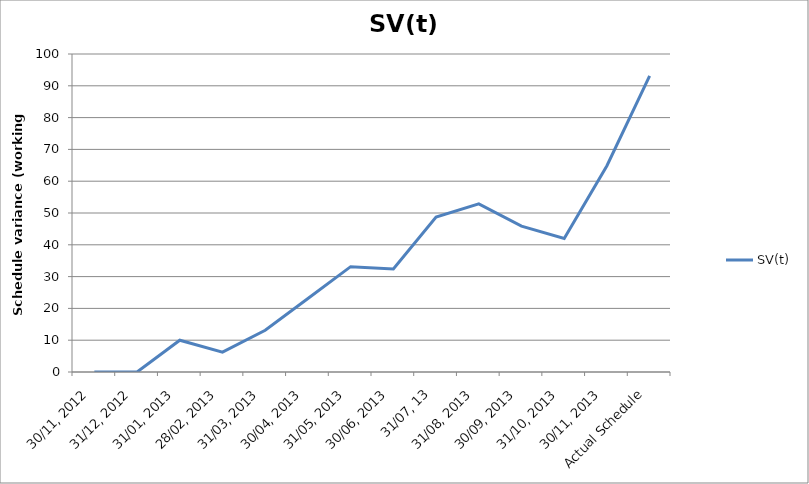
| Category | SV(t) |
|---|---|
| 30/11, 2012 | 0 |
| 31/12, 2012 | 0 |
| 31/01, 2013 | 10 |
| 28/02, 2013 | 6.25 |
| 31/03, 2013 | 13.125 |
| 30/04, 2013 | 23.125 |
| 31/05, 2013 | 33.125 |
| 30/06, 2013 | 32.375 |
| 31/07, 13 | 48.75 |
| 31/08, 2013 | 52.875 |
| 30/09, 2013 | 45.875 |
| 31/10, 2013 | 42 |
| 30/11, 2013 | 64.875 |
| Actual Schedule | 93.125 |